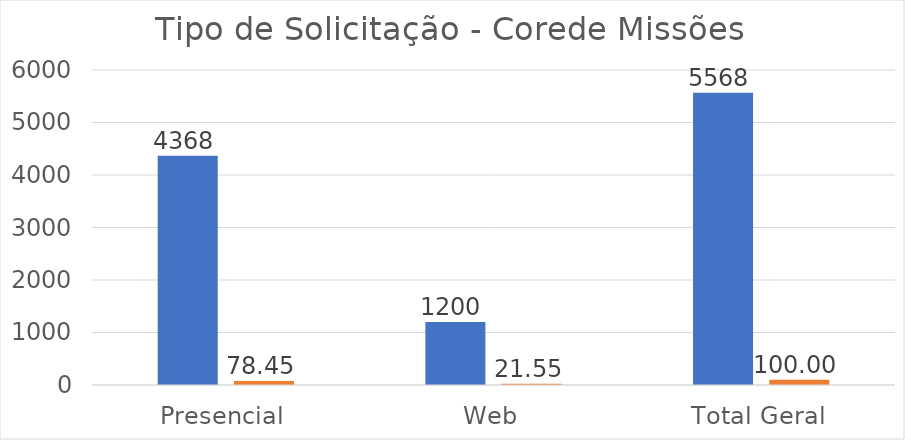
| Category | Series 0 | Series 1 |
|---|---|---|
| Presencial | 4368 | 78.448 |
| Web | 1200 | 21.552 |
| Total Geral | 5568 | 100 |